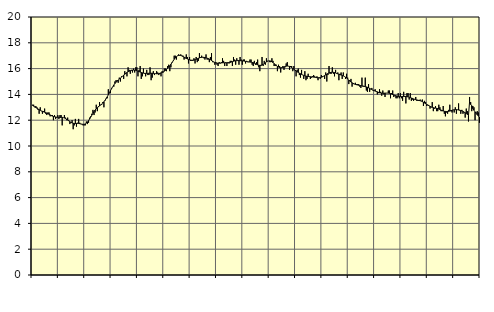
| Category | Piggar | Series 1 |
|---|---|---|
| nan | 13.2 | 13.14 |
| 87.0 | 13.2 | 13.09 |
| 87.0 | 13 | 13.04 |
| 87.0 | 13.1 | 12.98 |
| 87.0 | 13 | 12.93 |
| 87.0 | 12.8 | 12.87 |
| 87.0 | 12.5 | 12.82 |
| 87.0 | 13 | 12.77 |
| 87.0 | 12.7 | 12.72 |
| 87.0 | 12.5 | 12.69 |
| 87.0 | 12.7 | 12.65 |
| 87.0 | 12.9 | 12.62 |
| nan | 12.5 | 12.59 |
| 88.0 | 12.4 | 12.55 |
| 88.0 | 12.6 | 12.51 |
| 88.0 | 12.6 | 12.46 |
| 88.0 | 12.3 | 12.41 |
| 88.0 | 12.4 | 12.36 |
| 88.0 | 12.4 | 12.32 |
| 88.0 | 12 | 12.29 |
| 88.0 | 12.4 | 12.27 |
| 88.0 | 12.1 | 12.25 |
| 88.0 | 12.2 | 12.23 |
| 88.0 | 12.4 | 12.23 |
| nan | 12.1 | 12.23 |
| 89.0 | 12.4 | 12.22 |
| 89.0 | 12.4 | 12.22 |
| 89.0 | 11.6 | 12.22 |
| 89.0 | 12.2 | 12.2 |
| 89.0 | 12.4 | 12.17 |
| 89.0 | 12.2 | 12.13 |
| 89.0 | 12 | 12.08 |
| 89.0 | 12.2 | 12.01 |
| 89.0 | 12 | 11.95 |
| 89.0 | 11.7 | 11.88 |
| 89.0 | 11.8 | 11.83 |
| nan | 12 | 11.79 |
| 90.0 | 11.3 | 11.76 |
| 90.0 | 11.6 | 11.75 |
| 90.0 | 12.1 | 11.74 |
| 90.0 | 11.5 | 11.75 |
| 90.0 | 11.8 | 11.75 |
| 90.0 | 12.1 | 11.75 |
| 90.0 | 11.8 | 11.73 |
| 90.0 | 11.7 | 11.71 |
| 90.0 | 11.7 | 11.69 |
| 90.0 | 11.6 | 11.68 |
| 90.0 | 11.6 | 11.68 |
| nan | 11.6 | 11.71 |
| 91.0 | 11.9 | 11.77 |
| 91.0 | 11.7 | 11.86 |
| 91.0 | 11.8 | 11.97 |
| 91.0 | 12.2 | 12.1 |
| 91.0 | 12.3 | 12.24 |
| 91.0 | 12.5 | 12.39 |
| 91.0 | 12.8 | 12.53 |
| 91.0 | 12.4 | 12.67 |
| 91.0 | 12.6 | 12.79 |
| 91.0 | 13.2 | 12.89 |
| 91.0 | 12.7 | 12.97 |
| nan | 13.1 | 13.04 |
| 92.0 | 13.4 | 13.11 |
| 92.0 | 13.2 | 13.17 |
| 92.0 | 13.2 | 13.25 |
| 92.0 | 13.4 | 13.33 |
| 92.0 | 13 | 13.43 |
| 92.0 | 13.5 | 13.54 |
| 92.0 | 13.7 | 13.67 |
| 92.0 | 13.7 | 13.81 |
| 92.0 | 14.4 | 13.97 |
| 92.0 | 14.1 | 14.13 |
| 92.0 | 14.1 | 14.29 |
| nan | 14.5 | 14.45 |
| 93.0 | 14.6 | 14.6 |
| 93.0 | 14.6 | 14.73 |
| 93.0 | 15 | 14.84 |
| 93.0 | 15.1 | 14.94 |
| 93.0 | 15.1 | 15.03 |
| 93.0 | 14.9 | 15.11 |
| 93.0 | 15.3 | 15.19 |
| 93.0 | 15 | 15.26 |
| 93.0 | 15.4 | 15.34 |
| 93.0 | 15.4 | 15.41 |
| 93.0 | 15.2 | 15.49 |
| nan | 15.8 | 15.56 |
| 94.0 | 15.6 | 15.64 |
| 94.0 | 15.4 | 15.7 |
| 94.0 | 16.1 | 15.75 |
| 94.0 | 15.9 | 15.8 |
| 94.0 | 15.6 | 15.84 |
| 94.0 | 15.9 | 15.86 |
| 94.0 | 15.7 | 15.88 |
| 94.0 | 16 | 15.89 |
| 94.0 | 15.7 | 15.88 |
| 94.0 | 16.1 | 15.87 |
| 94.0 | 16.1 | 15.84 |
| nan | 15.4 | 15.81 |
| 95.0 | 15.9 | 15.77 |
| 95.0 | 16.2 | 15.73 |
| 95.0 | 15.2 | 15.7 |
| 95.0 | 15.4 | 15.67 |
| 95.0 | 16 | 15.65 |
| 95.0 | 15.6 | 15.63 |
| 95.0 | 15.4 | 15.63 |
| 95.0 | 15.9 | 15.63 |
| 95.0 | 15.5 | 15.63 |
| 95.0 | 15.5 | 15.64 |
| 95.0 | 16.1 | 15.64 |
| nan | 15.1 | 15.64 |
| 96.0 | 15.3 | 15.64 |
| 96.0 | 15.8 | 15.63 |
| 96.0 | 15.5 | 15.61 |
| 96.0 | 15.6 | 15.61 |
| 96.0 | 15.8 | 15.6 |
| 96.0 | 15.7 | 15.6 |
| 96.0 | 15.5 | 15.61 |
| 96.0 | 15.6 | 15.64 |
| 96.0 | 15.4 | 15.67 |
| 96.0 | 15.8 | 15.7 |
| 96.0 | 15.7 | 15.75 |
| nan | 16 | 15.8 |
| 97.0 | 16 | 15.86 |
| 97.0 | 15.8 | 15.93 |
| 97.0 | 16.2 | 16.02 |
| 97.0 | 16.3 | 16.12 |
| 97.0 | 15.8 | 16.22 |
| 97.0 | 16.1 | 16.34 |
| 97.0 | 16.5 | 16.46 |
| 97.0 | 16.6 | 16.59 |
| 97.0 | 17 | 16.72 |
| 97.0 | 17 | 16.83 |
| 97.0 | 16.7 | 16.92 |
| nan | 17 | 16.99 |
| 98.0 | 17.1 | 17.02 |
| 98.0 | 17 | 17.03 |
| 98.0 | 17.1 | 17.02 |
| 98.0 | 17 | 16.98 |
| 98.0 | 17 | 16.94 |
| 98.0 | 16.7 | 16.89 |
| 98.0 | 16.8 | 16.84 |
| 98.0 | 17.1 | 16.79 |
| 98.0 | 16.9 | 16.75 |
| 98.0 | 16.4 | 16.71 |
| 98.0 | 16.9 | 16.68 |
| nan | 16.6 | 16.66 |
| 99.0 | 16.6 | 16.65 |
| 99.0 | 16.6 | 16.65 |
| 99.0 | 16.8 | 16.66 |
| 99.0 | 16.4 | 16.68 |
| 99.0 | 16.9 | 16.72 |
| 99.0 | 16.5 | 16.76 |
| 99.0 | 16.6 | 16.8 |
| 99.0 | 17.2 | 16.83 |
| 99.0 | 16.9 | 16.86 |
| 99.0 | 17 | 16.87 |
| 99.0 | 16.9 | 16.88 |
| nan | 16.8 | 16.87 |
| 0.0 | 16.7 | 16.86 |
| 0.0 | 17.1 | 16.84 |
| 0.0 | 16.7 | 16.81 |
| 0.0 | 16.7 | 16.78 |
| 0.0 | 16.5 | 16.74 |
| 0.0 | 16.9 | 16.69 |
| 0.0 | 17.2 | 16.63 |
| 0.0 | 16.5 | 16.57 |
| 0.0 | 16.5 | 16.52 |
| 0.0 | 16.3 | 16.47 |
| 0.0 | 16.5 | 16.44 |
| nan | 16.3 | 16.42 |
| 1.0 | 16.2 | 16.42 |
| 1.0 | 16.5 | 16.42 |
| 1.0 | 16.4 | 16.43 |
| 1.0 | 16.5 | 16.44 |
| 1.0 | 16.8 | 16.45 |
| 1.0 | 16.6 | 16.45 |
| 1.0 | 16.2 | 16.45 |
| 1.0 | 16.5 | 16.45 |
| 1.0 | 16.2 | 16.45 |
| 1.0 | 16.5 | 16.45 |
| 1.0 | 16.4 | 16.46 |
| nan | 16.6 | 16.48 |
| 2.0 | 16.6 | 16.51 |
| 2.0 | 16.2 | 16.54 |
| 2.0 | 16.9 | 16.57 |
| 2.0 | 16.7 | 16.59 |
| 2.0 | 16.3 | 16.61 |
| 2.0 | 16.8 | 16.62 |
| 2.0 | 16.6 | 16.62 |
| 2.0 | 16.3 | 16.62 |
| 2.0 | 16.9 | 16.61 |
| 2.0 | 16.7 | 16.61 |
| 2.0 | 16.3 | 16.6 |
| nan | 16.7 | 16.59 |
| 3.0 | 16.7 | 16.58 |
| 3.0 | 16.4 | 16.56 |
| 3.0 | 16.6 | 16.55 |
| 3.0 | 16.5 | 16.53 |
| 3.0 | 16.5 | 16.52 |
| 3.0 | 16.7 | 16.51 |
| 3.0 | 16.7 | 16.5 |
| 3.0 | 16.3 | 16.48 |
| 3.0 | 16.2 | 16.46 |
| 3.0 | 16.6 | 16.42 |
| 3.0 | 16.3 | 16.38 |
| nan | 16.5 | 16.33 |
| 4.0 | 16.7 | 16.29 |
| 4.0 | 16.1 | 16.26 |
| 4.0 | 15.8 | 16.25 |
| 4.0 | 16.2 | 16.26 |
| 4.0 | 16.9 | 16.29 |
| 4.0 | 16.2 | 16.33 |
| 4.0 | 16.6 | 16.39 |
| 4.0 | 16.3 | 16.45 |
| 4.0 | 16.8 | 16.52 |
| 4.0 | 16.6 | 16.57 |
| 4.0 | 16.6 | 16.6 |
| nan | 16.5 | 16.6 |
| 5.0 | 16.5 | 16.58 |
| 5.0 | 16.8 | 16.53 |
| 5.0 | 16.6 | 16.47 |
| 5.0 | 16.2 | 16.39 |
| 5.0 | 16.2 | 16.31 |
| 5.0 | 16.3 | 16.24 |
| 5.0 | 15.8 | 16.17 |
| 5.0 | 16.3 | 16.12 |
| 5.0 | 16.2 | 16.08 |
| 5.0 | 15.7 | 16.07 |
| 5.0 | 16.1 | 16.08 |
| nan | 16.2 | 16.1 |
| 6.0 | 15.9 | 16.13 |
| 6.0 | 16.1 | 16.16 |
| 6.0 | 16.4 | 16.19 |
| 6.0 | 16.5 | 16.2 |
| 6.0 | 16.2 | 16.19 |
| 6.0 | 15.9 | 16.17 |
| 6.0 | 16.2 | 16.13 |
| 6.0 | 16.2 | 16.08 |
| 6.0 | 15.8 | 16.01 |
| 6.0 | 16.2 | 15.95 |
| 6.0 | 15.9 | 15.88 |
| nan | 15.4 | 15.82 |
| 7.0 | 15.9 | 15.76 |
| 7.0 | 16 | 15.7 |
| 7.0 | 15.5 | 15.65 |
| 7.0 | 15.3 | 15.6 |
| 7.0 | 15.9 | 15.55 |
| 7.0 | 15.5 | 15.51 |
| 7.0 | 15.2 | 15.47 |
| 7.0 | 15.8 | 15.44 |
| 7.0 | 15.1 | 15.42 |
| 7.0 | 15.2 | 15.4 |
| 7.0 | 15.6 | 15.39 |
| nan | 15.4 | 15.38 |
| 8.0 | 15.2 | 15.37 |
| 8.0 | 15.3 | 15.36 |
| 8.0 | 15.4 | 15.35 |
| 8.0 | 15.5 | 15.34 |
| 8.0 | 15.4 | 15.33 |
| 8.0 | 15.3 | 15.31 |
| 8.0 | 15.4 | 15.3 |
| 8.0 | 15.1 | 15.29 |
| 8.0 | 15.3 | 15.3 |
| 8.0 | 15.2 | 15.31 |
| 8.0 | 15.5 | 15.33 |
| nan | 15.4 | 15.36 |
| 9.0 | 15.4 | 15.41 |
| 9.0 | 15.2 | 15.46 |
| 9.0 | 15.7 | 15.51 |
| 9.0 | 15 | 15.57 |
| 9.0 | 15.5 | 15.62 |
| 9.0 | 16.2 | 15.66 |
| 9.0 | 15.6 | 15.69 |
| 9.0 | 15.6 | 15.71 |
| 9.0 | 16.1 | 15.72 |
| 9.0 | 15.6 | 15.71 |
| 9.0 | 15.4 | 15.69 |
| nan | 15.9 | 15.66 |
| 10.0 | 15.6 | 15.62 |
| 10.0 | 15.7 | 15.59 |
| 10.0 | 15.1 | 15.56 |
| 10.0 | 15.6 | 15.53 |
| 10.0 | 15.7 | 15.5 |
| 10.0 | 15.2 | 15.47 |
| 10.0 | 15.7 | 15.44 |
| 10.0 | 15.4 | 15.39 |
| 10.0 | 15.2 | 15.33 |
| 10.0 | 15.6 | 15.27 |
| 10.0 | 15.3 | 15.19 |
| nan | 14.8 | 15.11 |
| 11.0 | 15.1 | 15.03 |
| 11.0 | 15.2 | 14.96 |
| 11.0 | 14.6 | 14.9 |
| 11.0 | 14.8 | 14.85 |
| 11.0 | 14.8 | 14.81 |
| 11.0 | 14.9 | 14.77 |
| 11.0 | 14.8 | 14.75 |
| 11.0 | 14.8 | 14.73 |
| 11.0 | 14.8 | 14.71 |
| 11.0 | 14.6 | 14.7 |
| 11.0 | 14.5 | 14.68 |
| nan | 15.3 | 14.66 |
| 12.0 | 14.6 | 14.65 |
| 12.0 | 14.6 | 14.63 |
| 12.0 | 15.3 | 14.6 |
| 12.0 | 14.3 | 14.58 |
| 12.0 | 14.2 | 14.55 |
| 12.0 | 14.8 | 14.51 |
| 12.0 | 14.2 | 14.47 |
| 12.0 | 14.4 | 14.42 |
| 12.0 | 14.5 | 14.38 |
| 12.0 | 14.3 | 14.33 |
| 12.0 | 14.3 | 14.29 |
| nan | 14.4 | 14.26 |
| 13.0 | 14.2 | 14.23 |
| 13.0 | 14 | 14.2 |
| 13.0 | 14.1 | 14.16 |
| 13.0 | 14.4 | 14.13 |
| 13.0 | 14.2 | 14.11 |
| 13.0 | 13.9 | 14.1 |
| 13.0 | 14.3 | 14.09 |
| 13.0 | 14 | 14.09 |
| 13.0 | 13.8 | 14.1 |
| 13.0 | 14.1 | 14.1 |
| 13.0 | 14.1 | 14.1 |
| nan | 14.3 | 14.1 |
| 14.0 | 14.3 | 14.08 |
| 14.0 | 13.7 | 14.06 |
| 14.0 | 14.1 | 14.03 |
| 14.0 | 14.3 | 13.99 |
| 14.0 | 13.8 | 13.96 |
| 14.0 | 13.9 | 13.92 |
| 14.0 | 13.7 | 13.89 |
| 14.0 | 13.7 | 13.86 |
| 14.0 | 14.1 | 13.84 |
| 14.0 | 13.7 | 13.83 |
| 14.0 | 14.1 | 13.83 |
| nan | 13.7 | 13.83 |
| 15.0 | 13.5 | 13.84 |
| 15.0 | 14.2 | 13.84 |
| 15.0 | 13.8 | 13.84 |
| 15.0 | 13.3 | 13.84 |
| 15.0 | 14.1 | 13.82 |
| 15.0 | 14.1 | 13.81 |
| 15.0 | 13.6 | 13.78 |
| 15.0 | 14.1 | 13.76 |
| 15.0 | 13.5 | 13.72 |
| 15.0 | 13.6 | 13.69 |
| 15.0 | 13.5 | 13.65 |
| nan | 13.6 | 13.62 |
| 16.0 | 13.8 | 13.59 |
| 16.0 | 13.5 | 13.57 |
| 16.0 | 13.5 | 13.55 |
| 16.0 | 13.5 | 13.53 |
| 16.0 | 13.6 | 13.51 |
| 16.0 | 13.5 | 13.48 |
| 16.0 | 13.6 | 13.44 |
| 16.0 | 13.1 | 13.39 |
| 16.0 | 13.5 | 13.33 |
| 16.0 | 13.4 | 13.28 |
| 16.0 | 13.1 | 13.22 |
| nan | 13.2 | 13.17 |
| 17.0 | 13.1 | 13.12 |
| 17.0 | 12.9 | 13.07 |
| 17.0 | 13 | 13.03 |
| 17.0 | 13.4 | 13 |
| 17.0 | 12.7 | 12.97 |
| 17.0 | 12.9 | 12.95 |
| 17.0 | 13.1 | 12.94 |
| 17.0 | 12.7 | 12.92 |
| 17.0 | 12.7 | 12.9 |
| 17.0 | 13.2 | 12.87 |
| 17.0 | 13 | 12.83 |
| nan | 12.7 | 12.79 |
| 18.0 | 12.7 | 12.75 |
| 18.0 | 13.1 | 12.72 |
| 18.0 | 12.5 | 12.69 |
| 18.0 | 12.3 | 12.68 |
| 18.0 | 12.6 | 12.67 |
| 18.0 | 12.5 | 12.68 |
| 18.0 | 12.8 | 12.69 |
| 18.0 | 13.2 | 12.71 |
| 18.0 | 12.7 | 12.74 |
| 18.0 | 12.6 | 12.77 |
| 18.0 | 12.8 | 12.8 |
| nan | 12.6 | 12.81 |
| 19.0 | 13 | 12.82 |
| 19.0 | 12.5 | 12.82 |
| 19.0 | 12.8 | 12.81 |
| 19.0 | 13.3 | 12.79 |
| 19.0 | 12.8 | 12.77 |
| 19.0 | 12.5 | 12.75 |
| 19.0 | 12.8 | 12.72 |
| 19.0 | 12.5 | 12.68 |
| 19.0 | 12.6 | 12.63 |
| 19.0 | 12.2 | 12.58 |
| 19.0 | 12.9 | 12.52 |
| nan | 12.7 | 12.45 |
| 20.0 | 11.9 | 12.37 |
| 20.0 | 13.8 | 13.43 |
| 20.0 | 13.4 | 13.23 |
| 20.0 | 12.7 | 13.12 |
| 20.0 | 13.1 | 12.9 |
| 20.0 | 13 | 12.77 |
| 20.0 | 12 | 12.65 |
| 20.0 | 12.6 | 12.53 |
| 20.0 | 12.7 | 12.42 |
| 20.0 | 12.6 | 12.33 |
| 20.0 | 11.8 | 12.24 |